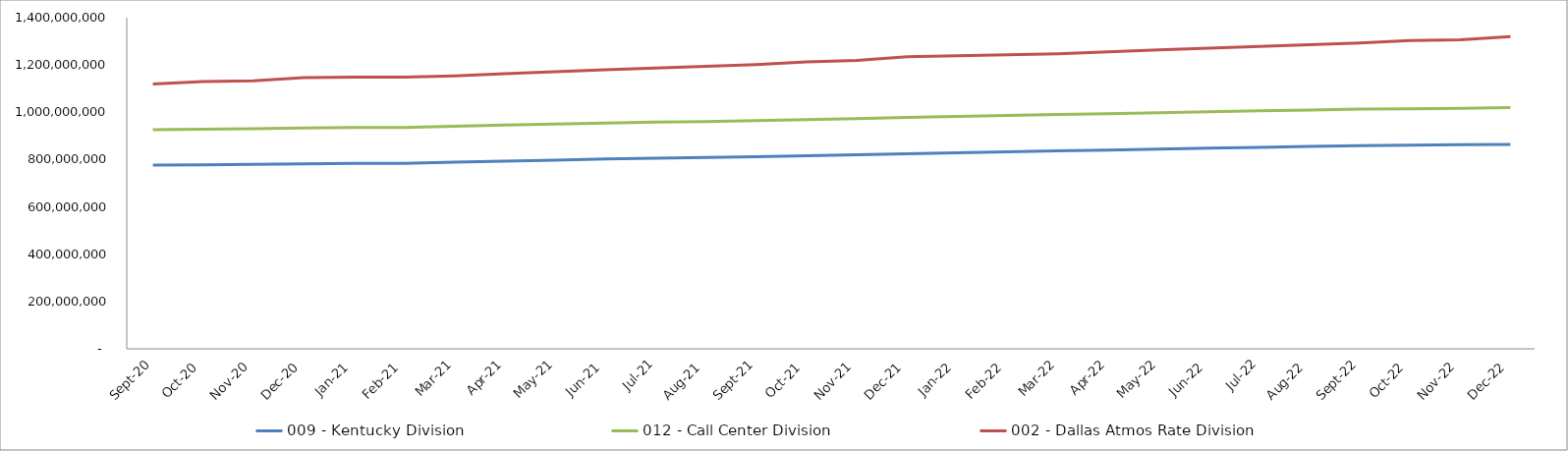
| Category | 009 - Kentucky Division | 012 - Call Center Division | 002 - Dallas Atmos Rate Division |
|---|---|---|---|
| 2020-09-30 | 776387470.49 | 150489527.96 | 193115081.34 |
| 2020-10-31 | 778312528.82 | 150596567.02 | 201191125.5 |
| 2020-11-30 | 779866772.89 | 150595343.46 | 202460485.87 |
| 2020-12-31 | 782521702.32 | 151347115.55 | 212854172.09 |
| 2021-01-31 | 783987048.82 | 151349105.67 | 212979966.39 |
| 2021-02-28 | 783940202.61 | 151886779.32 | 213033148.37 |
| 2021-03-31 | 789378347.64 | 151887346.06 | 213047849.24 |
| 2021-04-30 | 793782334.672 | 151969047.92 | 217293872.062 |
| 2021-05-31 | 798094059.87 | 152051168.04 | 221656734.83 |
| 2021-06-30 | 802398660.304 | 152132786.18 | 225621469.518 |
| 2021-07-31 | 806042233.702 | 152214484.03 | 229328677.477 |
| 2021-08-31 | 808684013.542 | 152295694.57 | 232944556.15 |
| 2021-09-30 | 812364667.48 | 152383442.47 | 236644399.221 |
| 2021-10-31 | 816329148.992 | 152490481.53 | 244693261.938 |
| 2021-11-30 | 820389131.978 | 152489257.97 | 245958350.038 |
| 2021-12-31 | 824732062.914 | 153241030.06 | 256384141.828 |
| 2022-01-31 | 828875121.154 | 153243020.18 | 256509512.743 |
| 2022-02-28 | 832853094.742 | 153780693.83 | 256562515.729 |
| 2022-03-31 | 836704443.23 | 153781260.57 | 256577167.121 |
| 2022-04-30 | 840563013.523 | 153862962.43 | 260823189.943 |
| 2022-05-31 | 844481347.481 | 153945082.55 | 265186052.711 |
| 2022-06-30 | 848315414.575 | 154026700.69 | 269150787.398 |
| 2022-07-31 | 852020102.107 | 154108398.54 | 272857995.358 |
| 2022-08-31 | 855511200.811 | 154189609.08 | 276473874.031 |
| 2022-09-30 | 858951445.529 | 154277356.98 | 280173717.101 |
| 2022-10-31 | 860755985.947 | 154384396.04 | 288222579.819 |
| 2022-11-30 | 862558250.255 | 154383172.48 | 289487667.918 |
| 2022-12-31 | 864505597.751 | 155134944.57 | 299913459.708 |